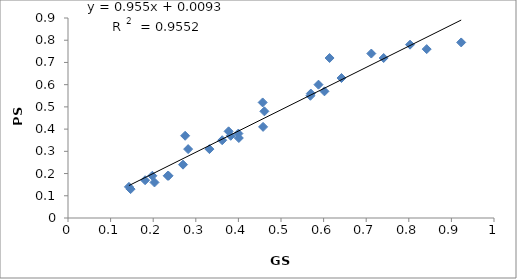
| Category | Series 0 |
|---|---|
| 0.181 | 0.17 |
| 0.198 | 0.19 |
| 0.147 | 0.13 |
| 0.382 | 0.37 |
| 0.4 | 0.38 |
| 0.143 | 0.14 |
| 0.282 | 0.31 |
| 0.614 | 0.72 |
| 0.842 | 0.76 |
| 0.275 | 0.37 |
| 0.461 | 0.48 |
| 0.377 | 0.39 |
| 0.362 | 0.35 |
| 0.401 | 0.36 |
| 0.457 | 0.52 |
| 0.602 | 0.57 |
| 0.569 | 0.55 |
| 0.642 | 0.63 |
| 0.57 | 0.56 |
| 0.588 | 0.6 |
| 0.741 | 0.72 |
| 0.803 | 0.78 |
| 0.712 | 0.74 |
| 0.923 | 0.79 |
| 0.458 | 0.41 |
| 0.236 | 0.19 |
| 0.27 | 0.24 |
| 0.332 | 0.31 |
| 0.203 | 0.16 |
| 0.234 | 0.19 |